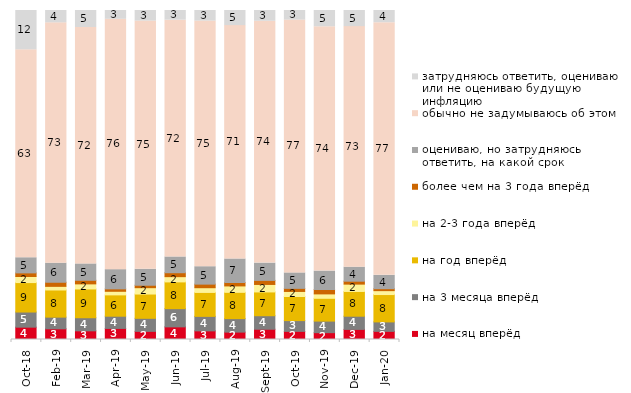
| Category | на месяц вперёд | на 3 месяца вперёд | на год вперёд | на 2-3 года вперёд | более чем на 3 года вперёд | оцениваю, но затрудняюсь ответить, на какой срок | обычно не задумываюсь об этом | затрудняюсь ответить, оцениваю или не оцениваю будущую инфляцию |
|---|---|---|---|---|---|---|---|---|
| 2018-10-01 | 3.75 | 4.6 | 8.95 | 1.85 | 1.1 | 4.6 | 63.2 | 11.95 |
| 2019-02-01 | 3.25 | 3.55 | 8.25 | 1.1 | 1.25 | 5.8 | 73.05 | 3.75 |
| 2019-03-01 | 2.636 | 3.978 | 8.752 | 1.542 | 1.094 | 4.973 | 71.855 | 5.172 |
| 2019-04-01 | 3.366 | 3.713 | 6.485 | 1.089 | 0.743 | 5.842 | 76.089 | 2.673 |
| 2019-05-01 | 2.476 | 3.962 | 7.38 | 1.932 | 0.743 | 4.854 | 75.433 | 3.219 |
| 2019-06-01 | 3.84 | 5.536 | 8.13 | 1.596 | 1.197 | 4.788 | 71.97 | 2.943 |
| 2019-07-01 | 2.624 | 4.406 | 7.277 | 1.436 | 1.089 | 5.297 | 74.653 | 3.218 |
| 2019-08-01 | 2.248 | 4.096 | 7.992 | 1.948 | 1.049 | 7.143 | 70.929 | 4.595 |
| 2019-09-01 | 3.119 | 4.109 | 7.228 | 2.277 | 1.238 | 5.248 | 73.515 | 3.267 |
| 2019-10-01 | 2.475 | 3.267 | 7.327 | 1.535 | 0.941 | 4.703 | 76.832 | 2.921 |
| 2019-11-01 | 2.079 | 3.515 | 6.931 | 1.337 | 1.337 | 5.594 | 74.257 | 4.95 |
| 2019-12-01 | 3.069 | 4.01 | 7.525 | 2.228 | 0.891 | 4.257 | 73.119 | 4.901 |
| 2020-01-01 | 2.475 | 2.871 | 8.317 | 1.188 | 0.594 | 4.059 | 76.782 | 3.713 |